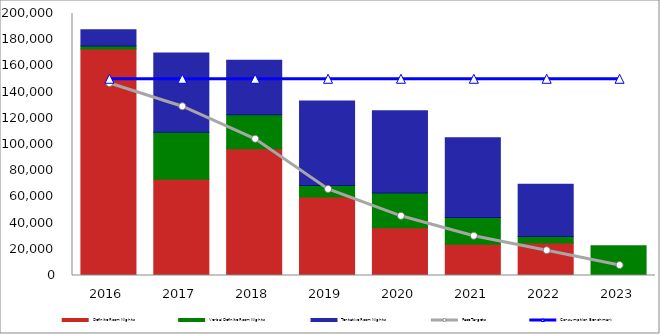
| Category | Definite Room Nights | Verbal Definite Room Nights | Tentative Room Nights |
|---|---|---|---|
| 2016.0 | 172859 | 2240 | 12500 |
| 2017.0 | 73455 | 35954 | 60425 |
| 2018.0 | 96840 | 25860 | 41543 |
| 2019.0 | 59928 | 8840 | 64512 |
| 2020.0 | 36496 | 26445 | 62737 |
| 2021.0 | 23925 | 20387 | 60792 |
| 2022.0 | 24769 | 5000 | 39974 |
| 2023.0 | 0 | 22743 | 0 |